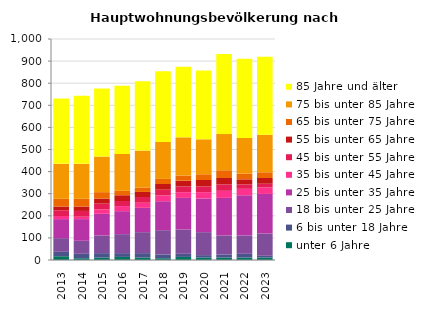
| Category | unter 6 Jahre | 6 bis unter 18 Jahre | 18 bis unter 25 Jahre | 25 bis unter 35 Jahre | 35 bis unter 45 Jahre | 45 bis unter 55 Jahre | 55 bis unter 65 Jahre | 65 bis unter 75 Jahre | 75 bis unter 85 Jahre | 85 Jahre und älter |
|---|---|---|---|---|---|---|---|---|---|---|
| 2013.0 | 17 | 20 | 62 | 86 | 14 | 26 | 17 | 35 | 158 | 296 |
| 2014.0 | 8 | 20 | 59 | 98 | 11 | 26 | 20 | 35 | 158 | 308 |
| 2015.0 | 11 | 20 | 80 | 98 | 20 | 26 | 23 | 29 | 161 | 308 |
| 2016.0 | 14 | 17 | 86 | 104 | 23 | 23 | 26 | 20 | 167 | 308 |
| 2017.0 | 11 | 20 | 95 | 110 | 23 | 26 | 23 | 20 | 167 | 314 |
| 2018.0 | 8 | 17 | 110 | 131 | 26 | 26 | 26 | 23 | 167 | 320 |
| 2019.0 | 14 | 14 | 110 | 143 | 26 | 26 | 26 | 23 | 173 | 320 |
| 2020.0 | 11 | 11 | 104 | 152 | 29 | 26 | 29 | 26 | 158 | 311 |
| 2021.0 | 11 | 14 | 86 | 170 | 32 | 29 | 29 | 35 | 164 | 362 |
| 2022.0 | 11 | 17 | 83 | 182 | 29 | 20 | 23 | 26 | 161 | 359 |
| 2023.0 | 11 | 8 | 101 | 179 | 29 | 17 | 26 | 26 | 170 | 353 |